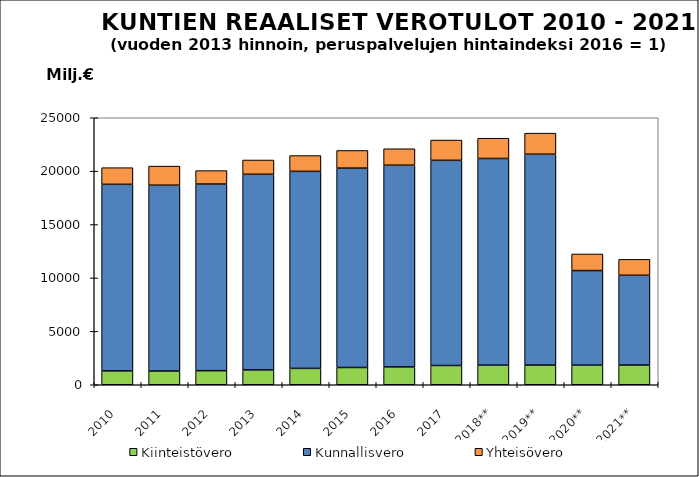
| Category | Kiinteistövero | Kunnallisvero | Yhteisövero |
|---|---|---|---|
| 2010 | 1296.352 | 17470.608 | 1559.108 |
| 2011 | 1285.841 | 17398.198 | 1789.548 |
| 2012 | 1317.524 | 17476.044 | 1257.689 |
| 2013 | 1389.588 | 18317.532 | 1337.058 |
| 2014 | 1532.817 | 18447.864 | 1481.581 |
| 2015 | 1616.418 | 18667.185 | 1654.236 |
| 2016 | 1669.703 | 18890.563 | 1537.872 |
| 2017 | 1802.836 | 19209.143 | 1898.989 |
| 2018** | 1833.713 | 19354.612 | 1894.165 |
| 2019** | 1839.714 | 19749.573 | 1968.991 |
| 2020** | 1837.488 | 8855.131 | 1554.046 |
| 2021** | 1846.233 | 8404.208 | 1490.449 |